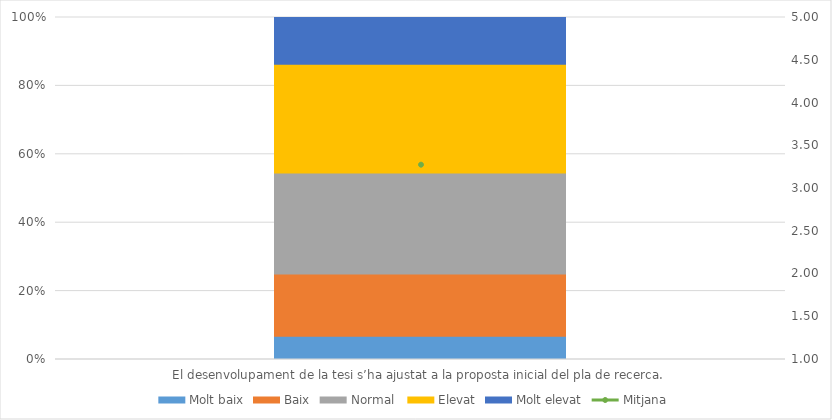
| Category | Molt baix | Baix | Normal  | Elevat | Molt elevat |
|---|---|---|---|---|---|
| El desenvolupament de la tesi s’ha ajustat a la proposta inicial del pla de recerca. | 3 | 8 | 13 | 14 | 6 |